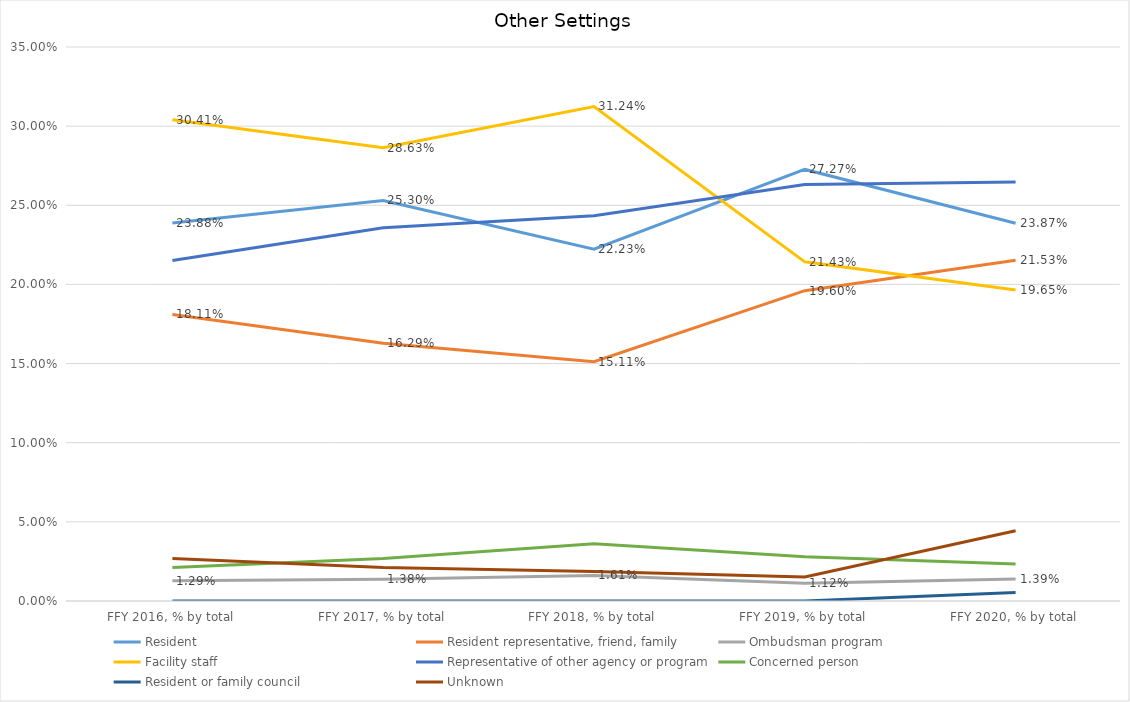
| Category | Resident | Resident representative, friend, family | Ombudsman program | Facility staff | Representative of other agency or program | Concerned person | Resident or family council | Unknown |
|---|---|---|---|---|---|---|---|---|
| FFY 2016, % by total | 0.239 | 0.181 | 0.013 | 0.304 | 0.215 | 0.021 | 0 | 0.027 |
| FFY 2017, % by total | 0.253 | 0.163 | 0.014 | 0.286 | 0.236 | 0.027 | 0 | 0.021 |
| FFY 2018, % by total | 0.222 | 0.151 | 0.016 | 0.312 | 0.243 | 0.036 | 0 | 0.019 |
| FFY 2019, % by total | 0.273 | 0.196 | 0.011 | 0.214 | 0.263 | 0.028 | 0 | 0.015 |
| FFY 2020, % by total | 0.239 | 0.215 | 0.014 | 0.197 | 0.265 | 0.023 | 0.005 | 0.044 |